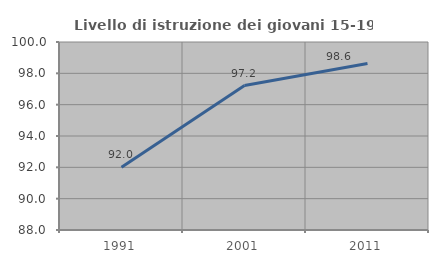
| Category | Livello di istruzione dei giovani 15-19 anni |
|---|---|
| 1991.0 | 92 |
| 2001.0 | 97.222 |
| 2011.0 | 98.63 |